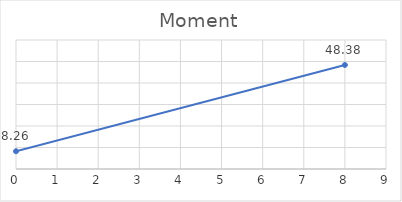
| Category | Series 0 |
|---|---|
| 0.0 | 8.257 |
| 8.0 | 48.376 |